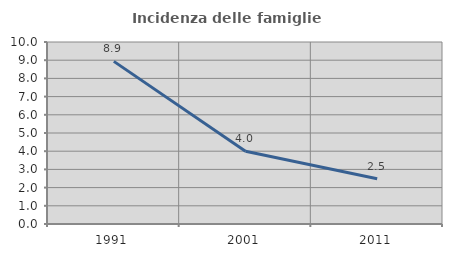
| Category | Incidenza delle famiglie numerose |
|---|---|
| 1991.0 | 8.936 |
| 2001.0 | 3.994 |
| 2011.0 | 2.485 |